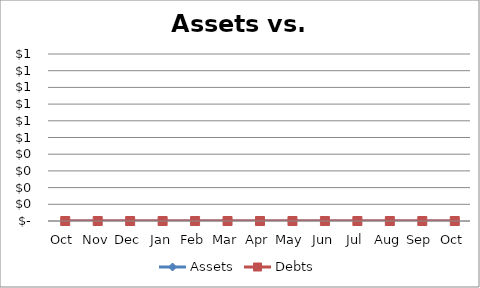
| Category | Assets | Debts |
|---|---|---|
| Oct | 0 | 0 |
| Nov | 0 | 0 |
| Dec | 0 | 0 |
| Jan | 0 | 0 |
| Feb | 0 | 0 |
| Mar | 0 | 0 |
| Apr | 0 | 0 |
| May | 0 | 0 |
| Jun | 0 | 0 |
| Jul | 0 | 0 |
| Aug | 0 | 0 |
| Sep | 0 | 0 |
| Oct | 0 | 0 |